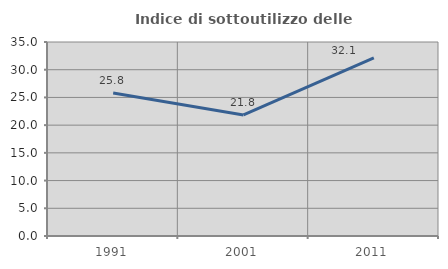
| Category | Indice di sottoutilizzo delle abitazioni  |
|---|---|
| 1991.0 | 25.794 |
| 2001.0 | 21.831 |
| 2011.0 | 32.143 |